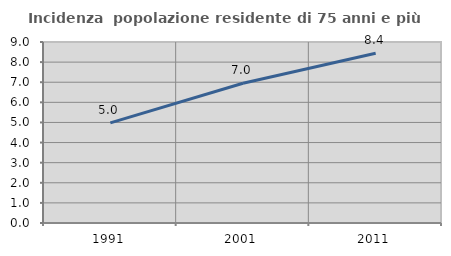
| Category | Incidenza  popolazione residente di 75 anni e più |
|---|---|
| 1991.0 | 4.979 |
| 2001.0 | 6.95 |
| 2011.0 | 8.442 |